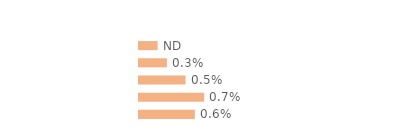
| Category | Series 0 |
|---|---|
| Communes rurales | 0.002 |
| moins de 20 000 hab. | 0.003 |
| 20 000 - 100 000 hab. | 0.005 |
| 100 000 hab. ou plus | 0.007 |
| Agglomération parisienne | 0.006 |